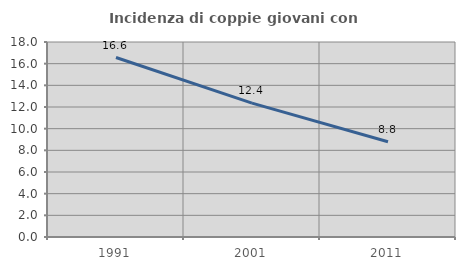
| Category | Incidenza di coppie giovani con figli |
|---|---|
| 1991.0 | 16.566 |
| 2001.0 | 12.353 |
| 2011.0 | 8.792 |